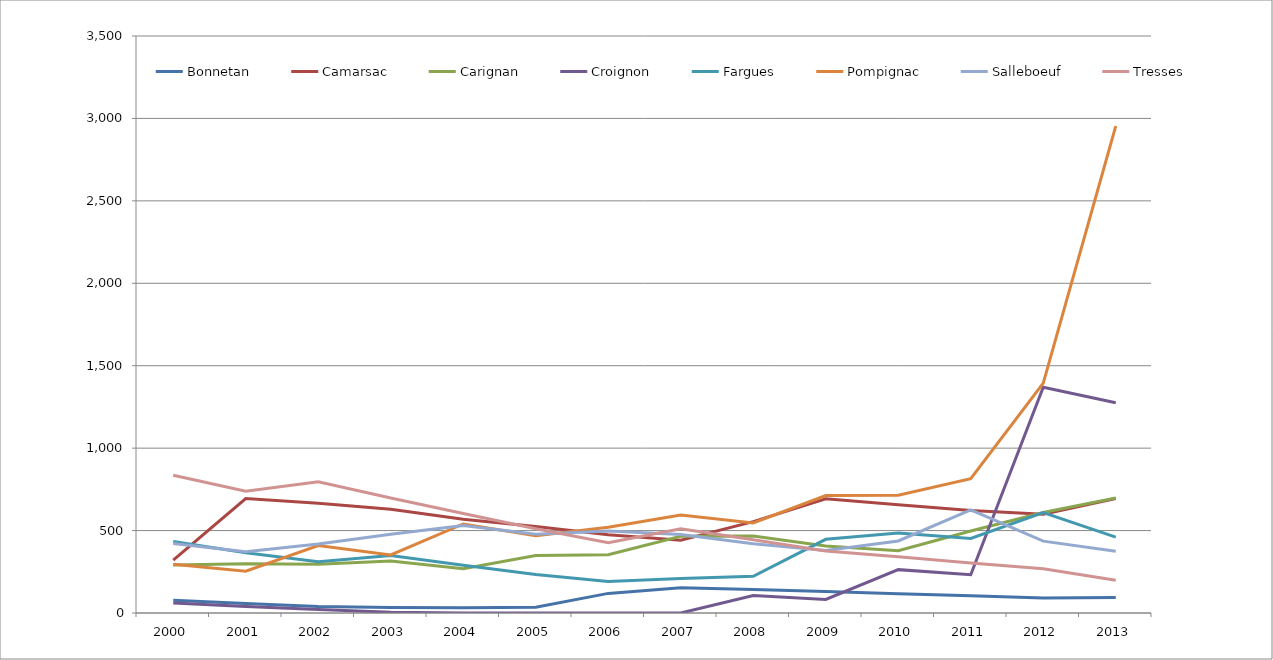
| Category | Bonnetan | Camarsac | Carignan | Croignon | Fargues | Pompignac | Salleboeuf | Tresses |
|---|---|---|---|---|---|---|---|---|
| 2000.0 | 77 | 321 | 291 | 60 | 434 | 296 | 421 | 836 |
| 2001.0 | 57 | 694 | 299 | 39 | 366 | 254 | 371 | 739 |
| 2002.0 | 39 | 666 | 295 | 21 | 311 | 409 | 418 | 796 |
| 2003.0 | 34 | 630 | 316 | 5 | 349 | 352 | 478 | 698 |
| 2004.0 | 32 | 569 | 269 | 0 | 289 | 540 | 530 | 603 |
| 2005.0 | 35 | 524 | 349 | 0 | 234 | 469 | 478 | 511 |
| 2006.0 | 119 | 475 | 354 | 0 | 191 | 520 | 498 | 426 |
| 2007.0 | 153 | 441 | 465 | 0 | 209 | 594 | 476 | 511 |
| 2008.0 | 142 | 554 | 467 | 106 | 223 | 546 | 420 | 444 |
| 2009.0 | 130 | 693 | 406 | 82 | 447 | 712 | 379 | 376 |
| 2010.0 | 117 | 657 | 378 | 263 | 485 | 715 | 437 | 341 |
| 2011.0 | 104 | 622 | 497 | 232 | 452 | 815 | 626 | 303 |
| 2012.0 | 91 | 599 | 610 | 1369 | 609 | 1394 | 436 | 268 |
| 2013.0 | 94 | 694 | 697 | 1275 | 460 | 2953 | 375 | 199 |